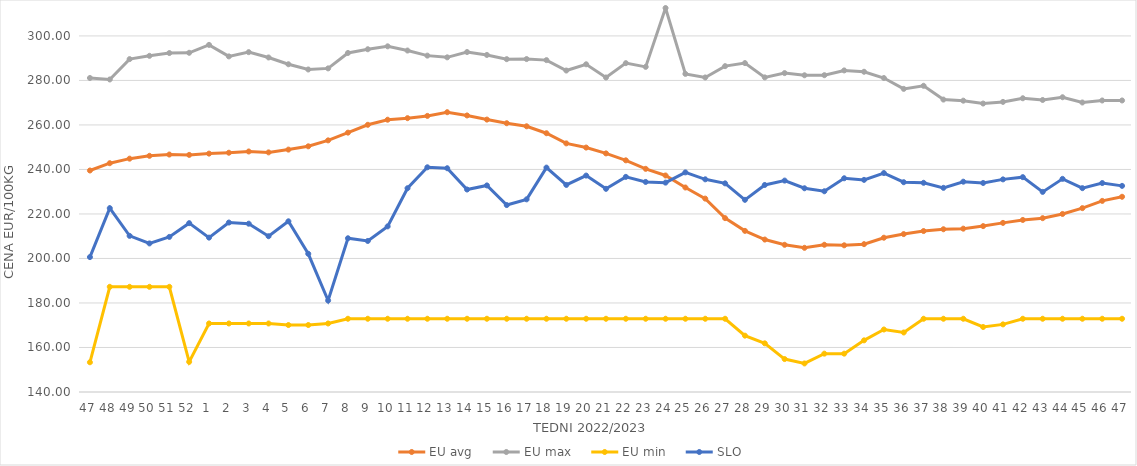
| Category | EU avg | EU max | EU min | SLO |
|---|---|---|---|---|
| 47.0 | 239.534 | 281.102 | 153.36 | 200.62 |
| 48.0 | 242.81 | 280.434 | 187.26 | 222.61 |
| 49.0 | 244.854 | 289.585 | 187.26 | 210.16 |
| 50.0 | 246.132 | 291.057 | 187.26 | 206.76 |
| 51.0 | 246.705 | 292.307 | 187.26 | 209.69 |
| 52.0 | 246.546 | 292.426 | 153.54 | 215.87 |
| 1.0 | 247.118 | 295.98 | 170.79 | 209.37 |
| 2.0 | 247.516 | 290.8 | 170.79 | 216.15 |
| 3.0 | 248.079 | 292.71 | 170.79 | 215.63 |
| 4.0 | 247.672 | 290.32 | 170.79 | 210 |
| 5.0 | 248.924 | 287.27 | 170.09 | 216.7 |
| 6.0 | 250.4 | 284.92 | 170.09 | 202.1 |
| 7.0 | 253.074 | 285.42 | 170.79 | 181.11 |
| 8.0 | 256.543 | 292.35 | 172.91 | 209.08 |
| 9.0 | 260.066 | 294.02 | 172.91 | 207.87 |
| 10.0 | 262.352 | 295.33 | 172.91 | 214.42 |
| 11.0 | 263.049 | 293.44 | 172.91 | 231.56 |
| 12.0 | 264.068 | 291.15 | 172.91 | 240.97 |
| 13.0 | 265.73 | 290.38 | 172.91 | 240.55 |
| 14.0 | 264.262 | 292.763 | 172.91 | 230.99 |
| 15.0 | 262.411 | 291.46 | 172.91 | 232.82 |
| 16.0 | 260.77 | 289.56 | 172.91 | 224 |
| 17.0 | 259.395 | 289.61 | 172.91 | 226.57 |
| 18.0 | 256.275 | 289.13 | 172.91 | 240.83 |
| 19.0 | 251.716 | 284.45 | 172.91 | 233.05 |
| 20.0 | 249.836 | 287.26 | 172.91 | 237.25 |
| 21.0 | 247.212 | 281.33 | 172.91 | 231.3 |
| 22.0 | 244.103 | 287.77 | 172.91 | 236.67 |
| 23.0 | 240.279 | 286.1 | 172.91 | 234.39 |
| 24.0 | 237.289 | 312.54 | 172.91 | 234.08 |
| 25.0 | 231.895 | 282.95 | 172.91 | 238.69 |
| 26.0 | 226.903 | 281.34 | 172.91 | 235.57 |
| 27.0 | 218.126 | 286.43 | 172.91 | 233.75 |
| 28.0 | 212.406 | 287.8 | 165.32 | 226.35 |
| 29.0 | 208.504 | 281.37 | 161.87 | 233.03 |
| 30.0 | 206.149 | 283.3 | 154.8 | 235 |
| 31.0 | 204.79 | 282.32 | 152.83 | 231.55 |
| 32.0 | 206.16 | 282.36 | 157.23 | 230.2 |
| 33.0 | 205.917 | 284.5 | 157.23 | 236.04 |
| 34.0 | 206.436 | 283.9 | 163.21 | 235.32 |
| 35.0 | 209.326 | 281.09 | 168.085 | 238.39 |
| 36.0 | 210.957 | 276.21 | 166.745 | 234.27 |
| 37.0 | 212.325 | 277.59 | 172.91 | 234 |
| 38.0 | 213.132 | 271.4 | 172.91 | 231.74 |
| 39.0 | 213.398 | 270.91 | 172.91 | 234.5 |
| 40.0 | 214.545 | 269.62 | 169.209 | 233.92 |
| 41.0 | 215.989 | 270.36 | 170.387 | 235.54 |
| 42.0 | 217.307 | 271.99 | 172.91 | 236.54 |
| 43.0 | 218.117 | 271.22 | 172.91 | 229.92 |
| 44.0 | 220.002 | 272.45 | 172.91 | 235.77 |
| 45.0 | 222.624 | 270.09 | 172.91 | 231.6 |
| 46.0 | 225.87 | 270.99 | 172.91 | 233.89 |
| 47.0 | 227.726 | 271 | 172.91 | 232.62 |